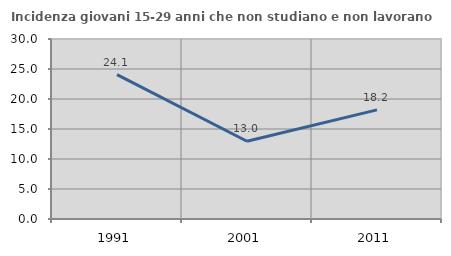
| Category | Incidenza giovani 15-29 anni che non studiano e non lavorano  |
|---|---|
| 1991.0 | 24.06 |
| 2001.0 | 12.963 |
| 2011.0 | 18.182 |